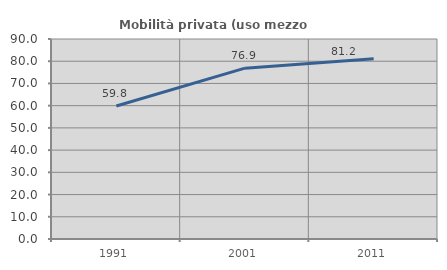
| Category | Mobilità privata (uso mezzo privato) |
|---|---|
| 1991.0 | 59.829 |
| 2001.0 | 76.871 |
| 2011.0 | 81.164 |